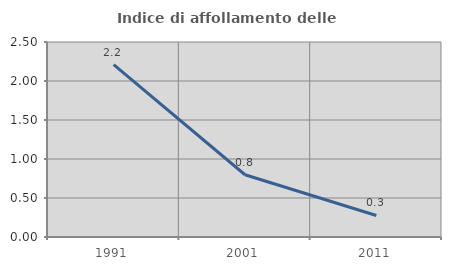
| Category | Indice di affollamento delle abitazioni  |
|---|---|
| 1991.0 | 2.209 |
| 2001.0 | 0.798 |
| 2011.0 | 0.276 |